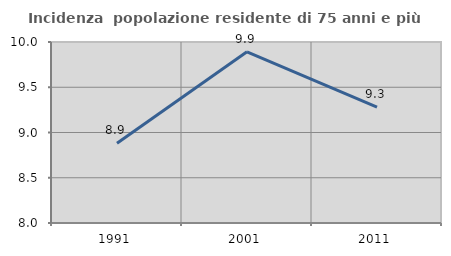
| Category | Incidenza  popolazione residente di 75 anni e più |
|---|---|
| 1991.0 | 8.881 |
| 2001.0 | 9.892 |
| 2011.0 | 9.282 |